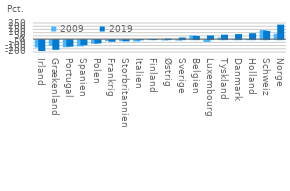
| Category | 2009 | 2019 |
|---|---|---|
| Irland | -115.7 | -168.9 |
| Grækenland | -87.5 | -150.3 |
| Portugal | -110.7 | -101.5 |
| Spanien | -97.6 | -79.6 |
| Polen | -57.3 | -51.5 |
| Frankrig | -14.8 | -25.2 |
| Storbritannien | -16.2 | -19 |
| Italien | -22.3 | -3.1 |
| Finland | 2.6 | 0.5 |
| Østrig | -5 | 7.8 |
| Sverige | -7.1 | 24.6 |
| Belgien | 58.2 | 48.8 |
| Luxembourg | -28.9 | 57.6 |
| Tyskland | 25.1 | 68.6 |
| Danmark | 0.9 | 78.2 |
| Holland | 1.4 | 91.4 |
| Schweiz  | 141.2 | 128 |
| Norge | 83.9 | 224.9 |